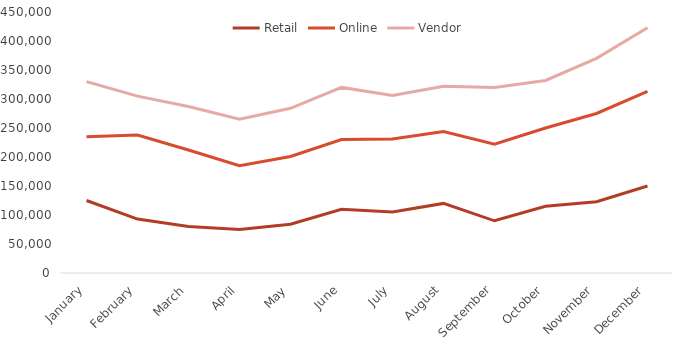
| Category | Retail | Online | Vendor |
|---|---|---|---|
| January | 125000 | 110000 | 95000 |
| February | 93000 | 145000 | 67000 |
| March | 80000 | 132000 | 75000 |
| April | 75000 | 110000 | 80000 |
| May | 84000 | 117000 | 83000 |
| June | 110000 | 120000 | 90000 |
| July | 105000 | 126000 | 75000 |
| August | 120000 | 124000 | 78000 |
| September | 90000 | 132000 | 98000 |
| October | 115000 | 135000 | 82000 |
| November | 123000 | 152000 | 95000 |
| December | 150000 | 163000 | 110000 |